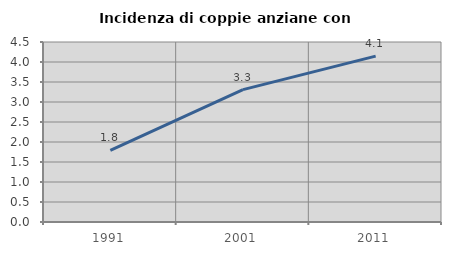
| Category | Incidenza di coppie anziane con figli |
|---|---|
| 1991.0 | 1.789 |
| 2001.0 | 3.31 |
| 2011.0 | 4.146 |